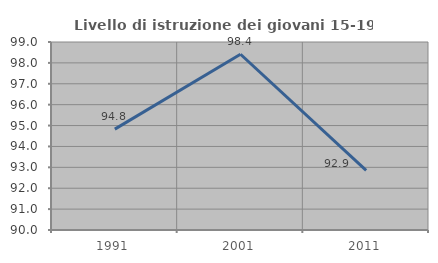
| Category | Livello di istruzione dei giovani 15-19 anni |
|---|---|
| 1991.0 | 94.828 |
| 2001.0 | 98.413 |
| 2011.0 | 92.857 |